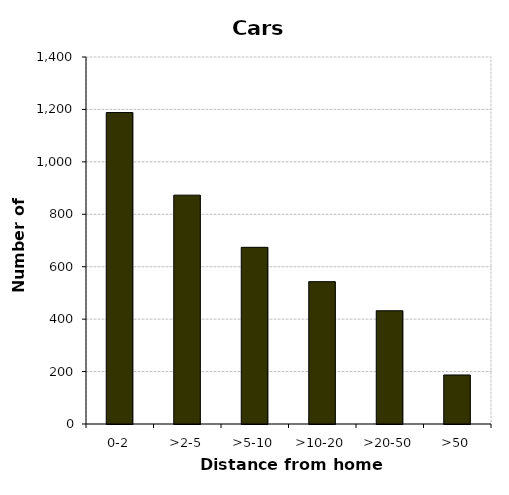
| Category | Cars |
|---|---|
| 0-2 | 1188 |
| >2-5 | 873 |
| >5-10 | 674 |
| >10-20 | 543 |
| >20-50 | 432 |
| >50 | 187 |